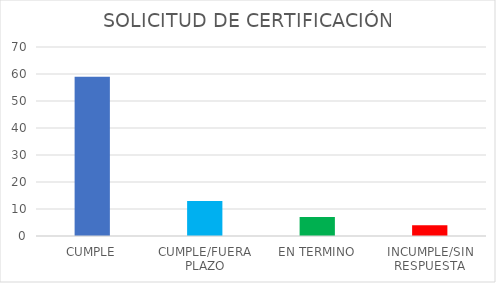
| Category | Series 0 |
|---|---|
| CUMPLE | 59 |
| CUMPLE/FUERA PLAZO | 13 |
| EN TERMINO | 7 |
| INCUMPLE/SIN RESPUESTA | 4 |